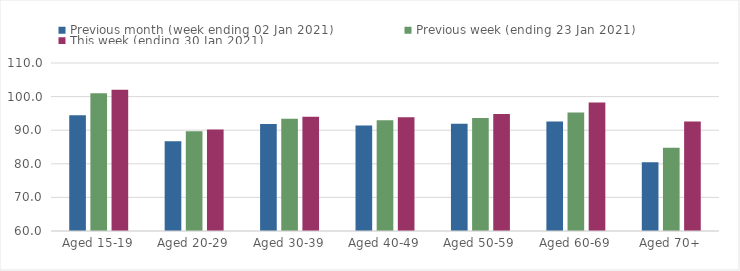
| Category | Previous month (week ending 02 Jan 2021) | Previous week (ending 23 Jan 2021) | This week (ending 30 Jan 2021) |
|---|---|---|---|
| Aged 15-19 | 94.42 | 101.03 | 102.01 |
| Aged 20-29 | 86.7 | 89.69 | 90.18 |
| Aged 30-39 | 91.88 | 93.39 | 93.98 |
| Aged 40-49 | 91.43 | 92.97 | 93.82 |
| Aged 50-59 | 91.9 | 93.65 | 94.83 |
| Aged 60-69 | 92.6 | 95.24 | 98.21 |
| Aged 70+ | 80.47 | 84.81 | 92.56 |